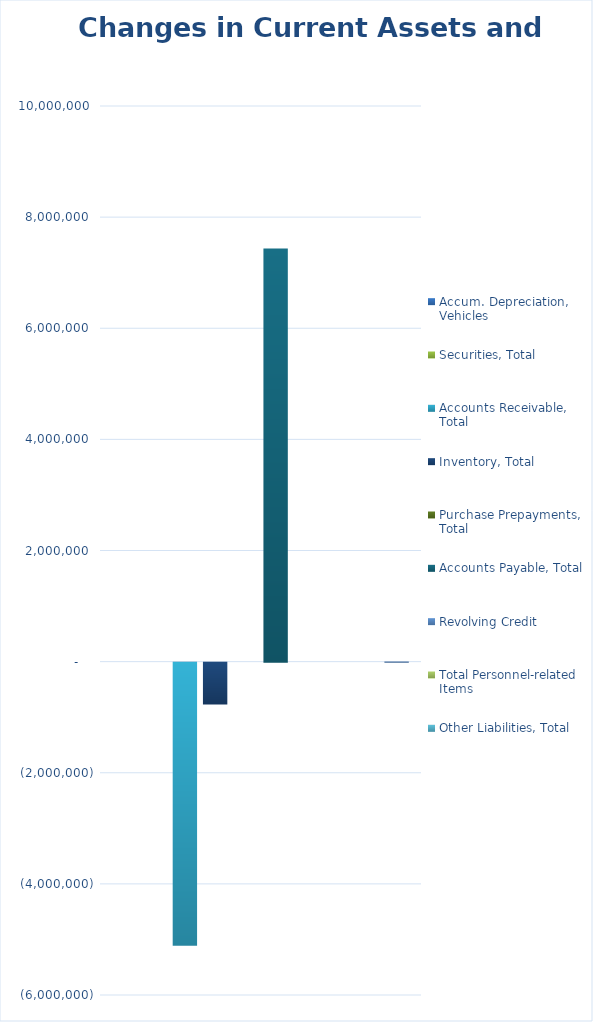
| Category | Accum. Depreciation, Vehicles | Securities, Total | Accounts Receivable, Total | Inventory, Total | Purchase Prepayments, Total | Accounts Payable, Total | Revolving Credit | Total Personnel-related Items | Other Liabilities, Total | #REF! |
|---|---|---|---|---|---|---|---|---|---|---|
| 0 | 0 | 0 | -5096355.75 | -754306.02 | 0 | 7436760.57 | 0 | 0 | 0 | 1 |